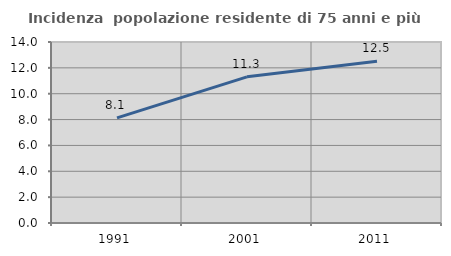
| Category | Incidenza  popolazione residente di 75 anni e più |
|---|---|
| 1991.0 | 8.134 |
| 2001.0 | 11.308 |
| 2011.0 | 12.509 |